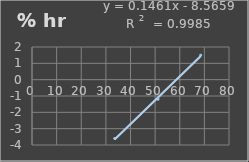
| Category | Humedad |
|---|---|
| 33.6 | -3.6 |
| 51.2 | -1.2 |
| 68.5 | 1.5 |